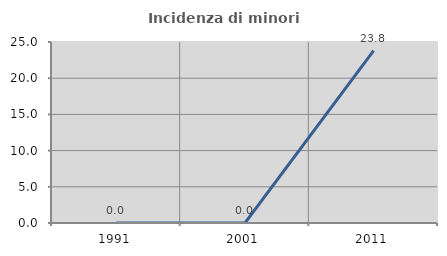
| Category | Incidenza di minori stranieri |
|---|---|
| 1991.0 | 0 |
| 2001.0 | 0 |
| 2011.0 | 23.81 |